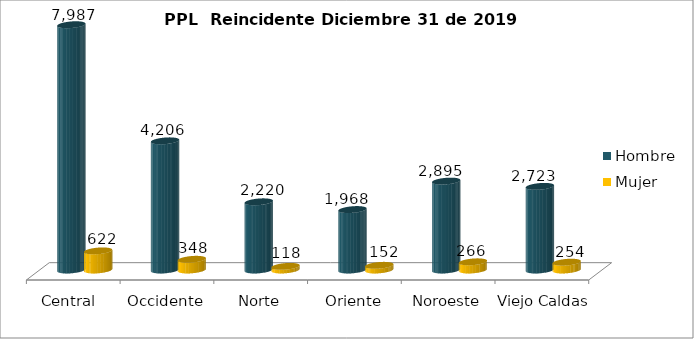
| Category | Hombre | Mujer |
|---|---|---|
| Central  | 7987 | 622 |
| Occidente | 4206 | 348 |
| Norte | 2220 | 118 |
| Oriente | 1968 | 152 |
| Noroeste | 2895 | 266 |
| Viejo Caldas | 2723 | 254 |